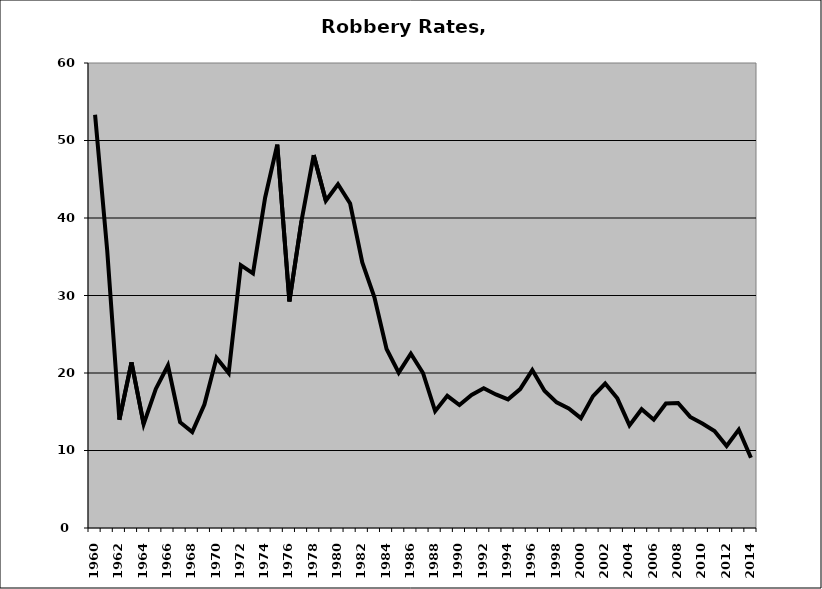
| Category | Robbery |
|---|---|
| 1960.0 | 53.323 |
| 1961.0 | 35.799 |
| 1962.0 | 13.973 |
| 1963.0 | 21.365 |
| 1964.0 | 13.411 |
| 1965.0 | 17.941 |
| 1966.0 | 20.973 |
| 1967.0 | 13.651 |
| 1968.0 | 12.381 |
| 1969.0 | 15.938 |
| 1970.0 | 21.96 |
| 1971.0 | 20 |
| 1972.0 | 33.913 |
| 1973.0 | 32.861 |
| 1974.0 | 42.618 |
| 1975.0 | 49.465 |
| 1976.0 | 29.231 |
| 1977.0 | 39.655 |
| 1978.0 | 48.113 |
| 1979.0 | 42.222 |
| 1980.0 | 44.354 |
| 1981.0 | 41.87 |
| 1982.0 | 34.263 |
| 1983.0 | 29.767 |
| 1984.0 | 23.092 |
| 1985.0 | 20.039 |
| 1986.0 | 22.485 |
| 1987.0 | 20 |
| 1988.0 | 15.074 |
| 1989.0 | 17.053 |
| 1990.0 | 15.873 |
| 1991.0 | 17.174 |
| 1992.0 | 18.026 |
| 1993.0 | 17.234 |
| 1994.0 | 16.597 |
| 1995.0 | 17.917 |
| 1996.0 | 20.374 |
| 1997.0 | 17.708 |
| 1998.0 | 16.216 |
| 1999.0 | 15.429 |
| 2000.0 | 14.176 |
| 2001.0 | 17.013 |
| 2002.0 | 18.644 |
| 2003.0 | 16.729 |
| 2004.0 | 13.244 |
| 2005.0 | 15.33 |
| 2006.0 | 13.98 |
| 2007.0 | 16.066 |
| 2008.0 | 16.136 |
| 2009.0 | 14.331 |
| 2010.0 | 13.484 |
| 2011.0 | 12.514 |
| 2012.0 | 10.579 |
| 2013.0 | 12.688 |
| 2014.0 | 9.073 |